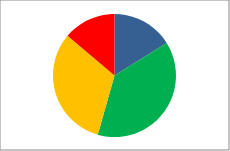
| Category | Series 1 |
|---|---|
| Outstanding | 35 |
| Good | 83 |
| RI | 69 |
| Inadequate | 30 |